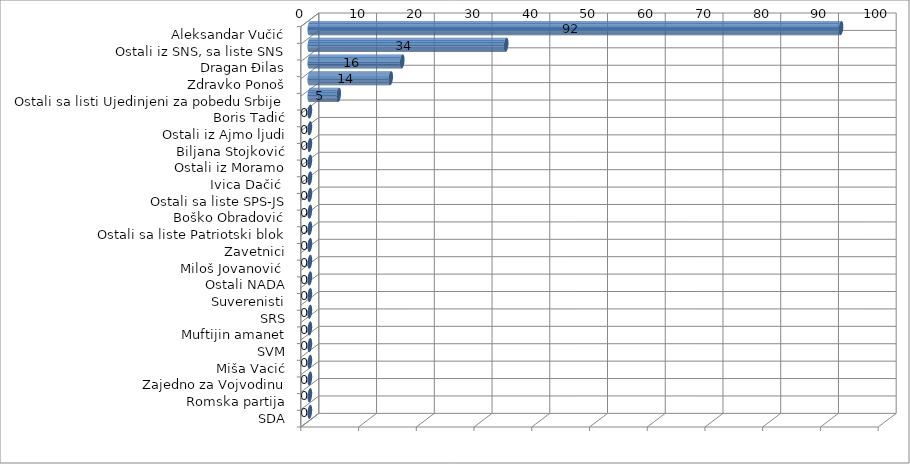
| Category | Series 0 |
|---|---|
| Aleksandar Vučić | 92 |
| Ostali iz SNS, sa liste SNS | 34 |
| Dragan Đilas | 16 |
| Zdravko Ponoš | 14 |
| Ostali sa listi Ujedinjeni za pobedu Srbije | 5 |
| Boris Tadić | 0 |
| Ostali iz Ajmo ljudi | 0 |
| Biljana Stojković | 0 |
| Ostali iz Moramo | 0 |
| Ivica Dačić  | 0 |
| Ostali sa liste SPS-JS | 0 |
| Boško Obradović | 0 |
| Ostali sa liste Patriotski blok | 0 |
| Zavetnici | 0 |
| Miloš Jovanović  | 0 |
| Ostali NADA | 0 |
| Suverenisti | 0 |
| SRS | 0 |
| Muftijin amanet | 0 |
| SVM | 0 |
| Miša Vacić | 0 |
| Zajedno za Vojvodinu | 0 |
| Romska partija | 0 |
| SDA | 0 |